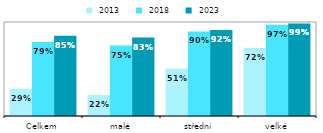
| Category |  2013 |  2018 |  2023 |
|---|---|---|---|
| Celkem | 0.289 | 0.786 | 0.854 |
| malé | 0.224 | 0.75 | 0.834 |
| střední | 0.505 | 0.9 | 0.916 |
| velké | 0.723 | 0.97 | 0.985 |